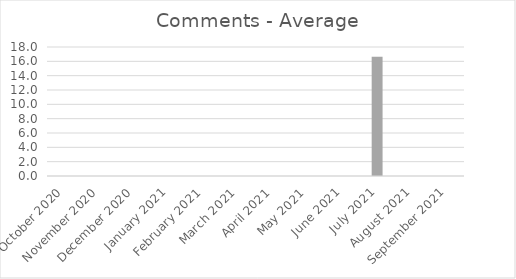
| Category | Average |
|---|---|
| October 2020 | 0 |
| November 2020 | 0 |
| December 2020 | 0 |
| January 2021 | 0 |
| February 2021 | 0 |
| March 2021 | 0 |
| April 2021 | 0 |
| May 2021 | 0 |
| June 2021 | 0 |
| July 2021 | 16.632 |
| August 2021 | 0 |
| September 2021 | 0 |